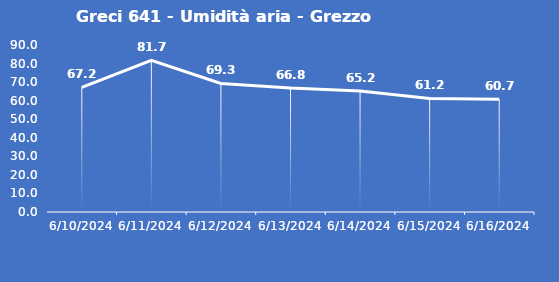
| Category | Greci 641 - Umidità aria - Grezzo (%) |
|---|---|
| 6/10/24 | 67.2 |
| 6/11/24 | 81.7 |
| 6/12/24 | 69.3 |
| 6/13/24 | 66.8 |
| 6/14/24 | 65.2 |
| 6/15/24 | 61.2 |
| 6/16/24 | 60.7 |